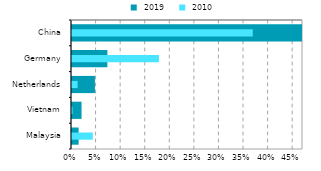
| Category |  2019 |
|---|---|
| Malaysia | 0.014 |
| Vietnam | 0.019 |
| Netherlands | 0.047 |
| Germany | 0.072 |
| China | 0.768 |